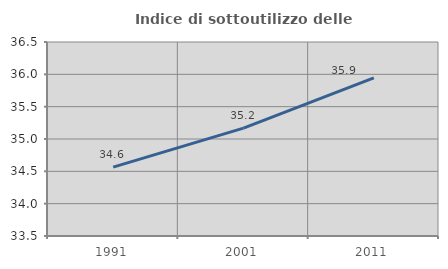
| Category | Indice di sottoutilizzo delle abitazioni  |
|---|---|
| 1991.0 | 34.566 |
| 2001.0 | 35.168 |
| 2011.0 | 35.944 |